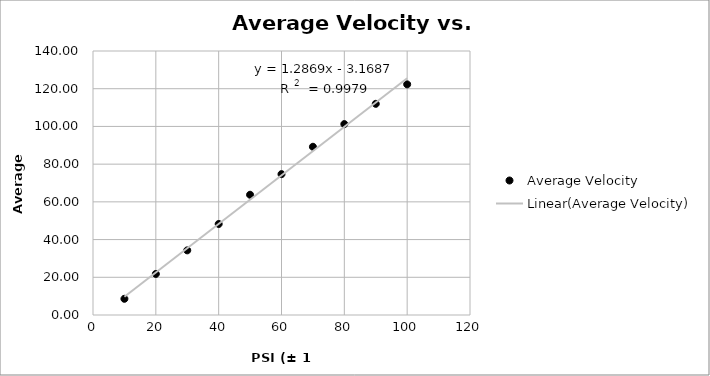
| Category | Average Velocity |
|---|---|
| 10.0 | 8.59 |
| 20.0 | 21.78 |
| 30.0 | 34.28 |
| 40.0 | 48.26 |
| 50.0 | 63.77 |
| 60.0 | 74.7 |
| 70.0 | 89.22 |
| 80.0 | 101.23 |
| 90.0 | 111.99 |
| 100.0 | 122.3 |